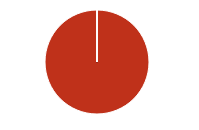
| Category | Total |
|---|---|
| Y | 0 |
| R | 0 |
| T | 0 |
| M | 0 |
| F | 0 |
| N | 147 |